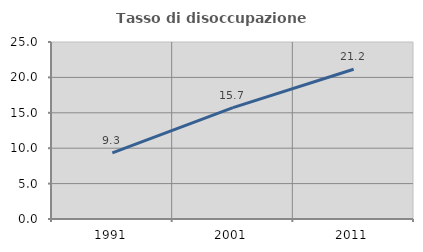
| Category | Tasso di disoccupazione giovanile  |
|---|---|
| 1991.0 | 9.333 |
| 2001.0 | 15.73 |
| 2011.0 | 21.154 |